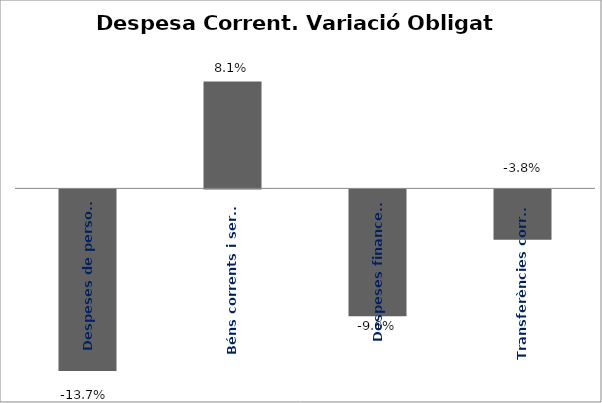
| Category | Series 0 |
|---|---|
| Despeses de personal | -0.137 |
| Béns corrents i serveis | 0.081 |
| Despeses financeres | -0.096 |
| Transferències corrents | -0.038 |